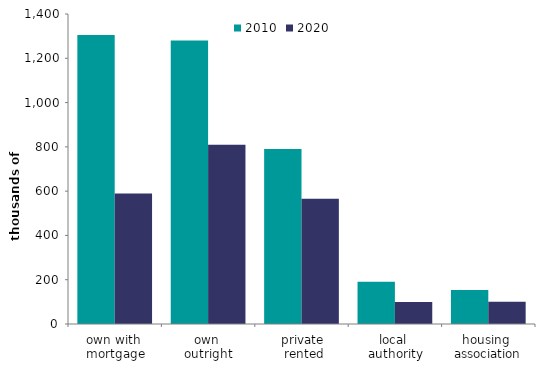
| Category | 2010 | 2020 |
|---|---|---|
| own with 
mortgage | 1305.114 | 589.605 |
| own 
outright | 1280.829 | 809.978 |
| private
 rented | 790.227 | 565.168 |
| local 
authority | 190.484 | 99.485 |
| housing 
association | 153.474 | 100.389 |